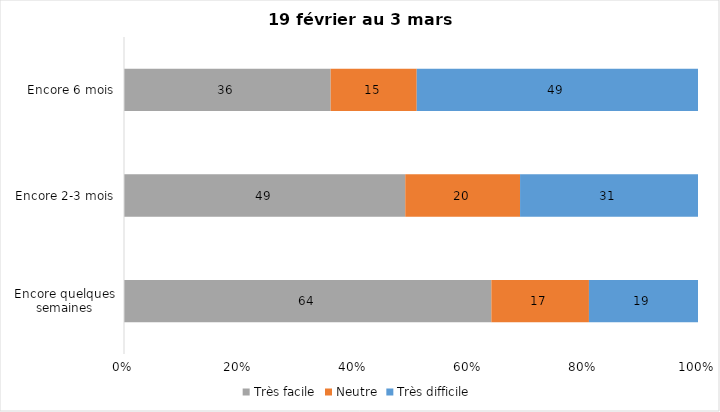
| Category | Très facile | Neutre | Très difficile |
|---|---|---|---|
| Encore quelques semaines | 64 | 17 | 19 |
| Encore 2-3 mois | 49 | 20 | 31 |
| Encore 6 mois | 36 | 15 | 49 |